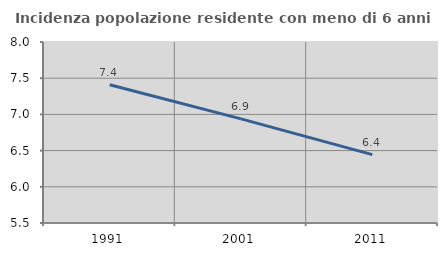
| Category | Incidenza popolazione residente con meno di 6 anni |
|---|---|
| 1991.0 | 7.409 |
| 2001.0 | 6.938 |
| 2011.0 | 6.444 |